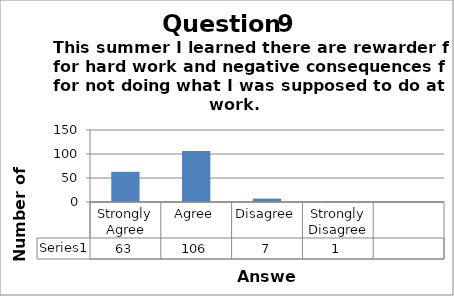
| Category | Series 0 |
|---|---|
| Strongly Agree | 63 |
| Agree | 106 |
| Disagree | 7 |
| Strongly Disagree | 1 |